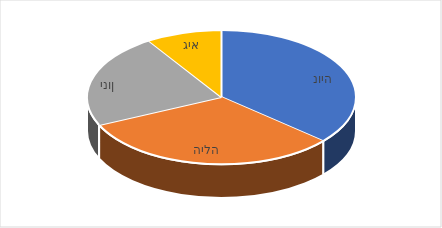
| Category | מכירות באפריל 2019 |
|---|---|
| נויה | 800 |
| הילה | 700 |
| ינון | 500 |
| גיא | 200 |